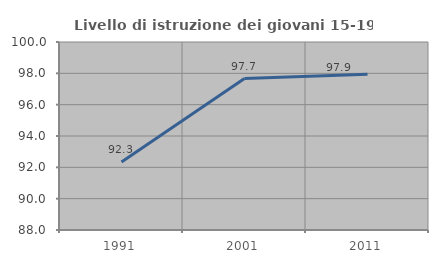
| Category | Livello di istruzione dei giovani 15-19 anni |
|---|---|
| 1991.0 | 92.345 |
| 2001.0 | 97.663 |
| 2011.0 | 97.934 |